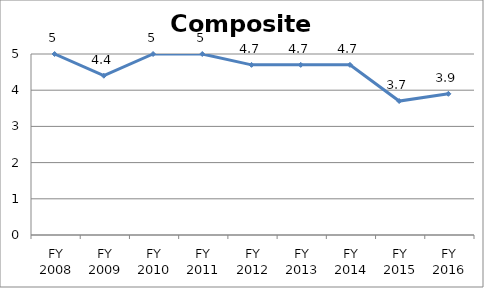
| Category | Composite score |
|---|---|
| FY 2016 | 3.9 |
| FY 2015 | 3.7 |
| FY 2014 | 4.7 |
| FY 2013 | 4.7 |
| FY 2012 | 4.7 |
| FY 2011 | 5 |
| FY 2010 | 5 |
| FY 2009 | 4.4 |
| FY 2008 | 5 |